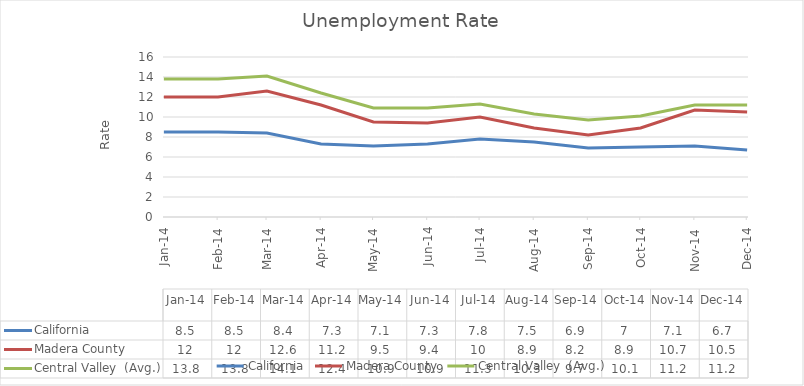
| Category | California | Madera County | Central Valley  (Avg.) |
|---|---|---|---|
| 2014-01-01 | 8.5 | 12 | 13.8 |
| 2014-02-01 | 8.5 | 12 | 13.8 |
| 2014-03-01 | 8.4 | 12.6 | 14.1 |
| 2014-04-01 | 7.3 | 11.2 | 12.4 |
| 2014-05-01 | 7.1 | 9.5 | 10.9 |
| 2014-06-01 | 7.3 | 9.4 | 10.9 |
| 2014-07-01 | 7.8 | 10 | 11.3 |
| 2014-08-01 | 7.5 | 8.9 | 10.3 |
| 2014-09-01 | 6.9 | 8.2 | 9.7 |
| 2014-10-01 | 7 | 8.9 | 10.1 |
| 2014-11-01 | 7.1 | 10.7 | 11.2 |
| 2014-12-01 | 6.7 | 10.5 | 11.2 |